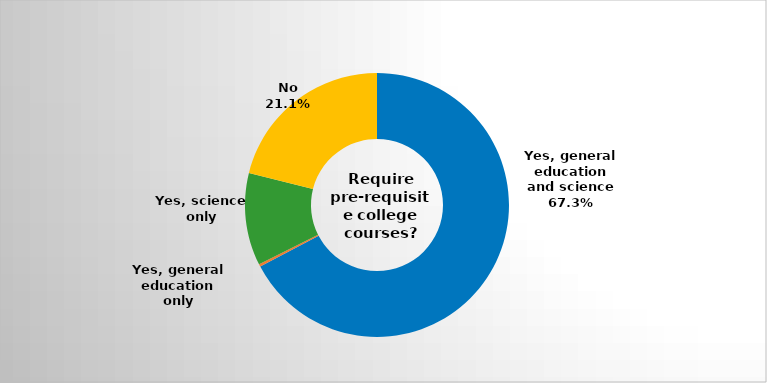
| Category | Series 0 |
|---|---|
| Yes, general education and science | 0.673 |
| Yes, general education only | 0.003 |
| Yes, science only | 0.113 |
| No | 0.211 |